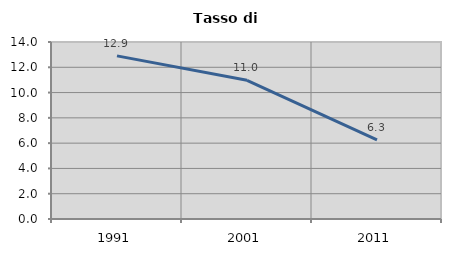
| Category | Tasso di disoccupazione   |
|---|---|
| 1991.0 | 12.903 |
| 2001.0 | 10.97 |
| 2011.0 | 6.25 |